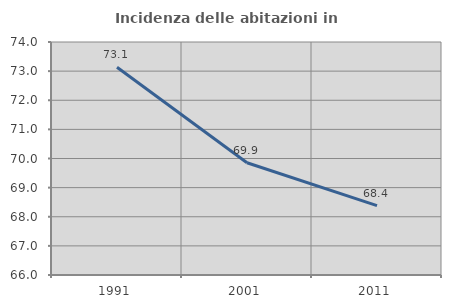
| Category | Incidenza delle abitazioni in proprietà  |
|---|---|
| 1991.0 | 73.133 |
| 2001.0 | 69.853 |
| 2011.0 | 68.382 |